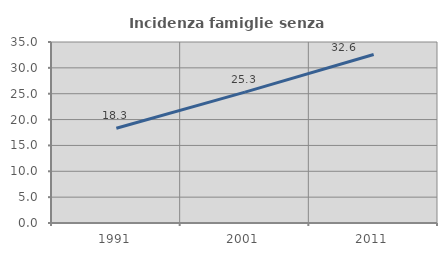
| Category | Incidenza famiglie senza nuclei |
|---|---|
| 1991.0 | 18.31 |
| 2001.0 | 25.307 |
| 2011.0 | 32.593 |